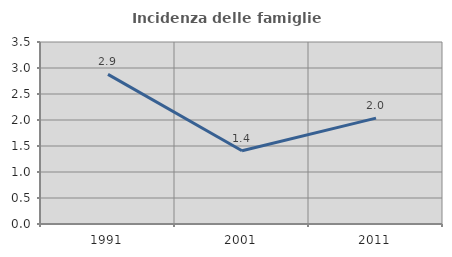
| Category | Incidenza delle famiglie numerose |
|---|---|
| 1991.0 | 2.878 |
| 2001.0 | 1.408 |
| 2011.0 | 2.036 |